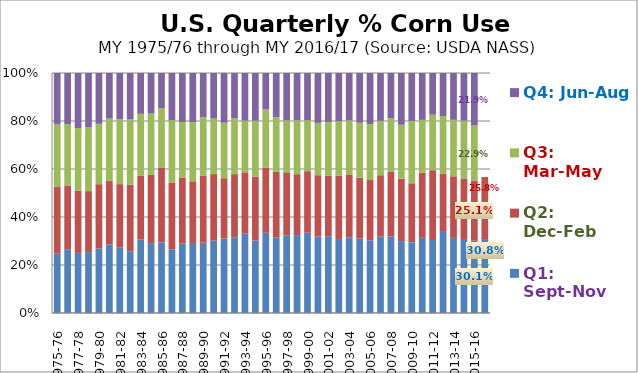
| Category | Q1: Sept-Nov | Q2: Dec-Feb | Q3: Mar-May | Q4: Jun-Aug |
|---|---|---|---|---|
| 1975-76 | 0.247 | 0.278 | 0.261 | 0.214 |
| 1976-77 | 0.265 | 0.266 | 0.255 | 0.213 |
| 1977-78 | 0.25 | 0.259 | 0.261 | 0.23 |
| 1978-79 | 0.254 | 0.254 | 0.266 | 0.226 |
| 1979-80 | 0.269 | 0.268 | 0.252 | 0.212 |
| 1980-81 | 0.285 | 0.266 | 0.259 | 0.19 |
| 1981-82 | 0.274 | 0.263 | 0.27 | 0.193 |
| 1982-83 | 0.257 | 0.277 | 0.273 | 0.193 |
| 1983-84 | 0.306 | 0.267 | 0.257 | 0.17 |
| 1984-85 | 0.291 | 0.286 | 0.254 | 0.169 |
| 1985-86 | 0.294 | 0.312 | 0.246 | 0.147 |
| 1986-87 | 0.265 | 0.279 | 0.259 | 0.196 |
| 1987-88 | 0.289 | 0.275 | 0.232 | 0.204 |
| 1988-89 | 0.292 | 0.257 | 0.246 | 0.205 |
| 1989-90 | 0.293 | 0.28 | 0.243 | 0.185 |
| 1990-91 | 0.301 | 0.277 | 0.232 | 0.19 |
| 1991-92 | 0.31 | 0.252 | 0.231 | 0.207 |
| 1992-93 | 0.315 | 0.263 | 0.233 | 0.189 |
| 1993-94 | 0.331 | 0.256 | 0.215 | 0.198 |
| 1994-95 | 0.302 | 0.267 | 0.233 | 0.199 |
| 1995-96 | 0.334 | 0.27 | 0.244 | 0.151 |
| 1996-97 | 0.314 | 0.274 | 0.228 | 0.184 |
| 1997-98 | 0.324 | 0.263 | 0.217 | 0.197 |
| 1998-99 | 0.325 | 0.254 | 0.225 | 0.197 |
| 1999-00 | 0.334 | 0.257 | 0.212 | 0.197 |
| 2000-01 | 0.319 | 0.255 | 0.218 | 0.208 |
| 2001-02 | 0.32 | 0.252 | 0.224 | 0.204 |
| 2002-03 | 0.309 | 0.264 | 0.227 | 0.2 |
| 2003-04 | 0.315 | 0.263 | 0.225 | 0.197 |
| 2004-05 | 0.311 | 0.253 | 0.229 | 0.207 |
| 2005-06 | 0.303 | 0.251 | 0.233 | 0.213 |
| 2006-07 | 0.318 | 0.256 | 0.227 | 0.199 |
| 2007-08 | 0.319 | 0.269 | 0.223 | 0.189 |
| 2008-09 | 0.3 | 0.26 | 0.225 | 0.216 |
| 2009-10 | 0.294 | 0.246 | 0.26 | 0.2 |
| 2010-11 | 0.313 | 0.272 | 0.22 | 0.195 |
| 2011-12 | 0.304 | 0.291 | 0.231 | 0.174 |
| 2012-13 | 0.338 | 0.242 | 0.241 | 0.179 |
| 2013-14 | 0.313 | 0.257 | 0.235 | 0.195 |
| 2014-15 | 0.308 | 0.252 | 0.241 | 0.199 |
| 2015-16 | 0.301 | 0.251 | 0.229 | 0.219 |
| 2016-17 | 0.308 | 0.258 | 0 | 0 |